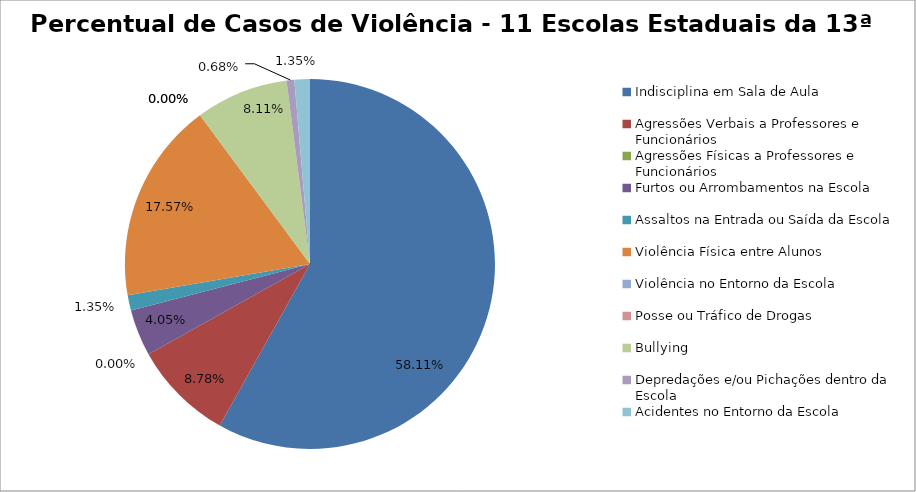
| Category | Percentual |
|---|---|
| Indisciplina em Sala de Aula | 0.581 |
| Agressões Verbais a Professores e Funcionários | 0.088 |
| Agressões Físicas a Professores e Funcionários | 0 |
| Furtos ou Arrombamentos na Escola | 0.041 |
| Assaltos na Entrada ou Saída da Escola | 0.014 |
| Violência Física entre Alunos | 0.176 |
| Violência no Entorno da Escola | 0 |
| Posse ou Tráfico de Drogas | 0 |
| Bullying | 0.081 |
| Depredações e/ou Pichações dentro da Escola | 0.007 |
| Acidentes no Entorno da Escola | 0.014 |